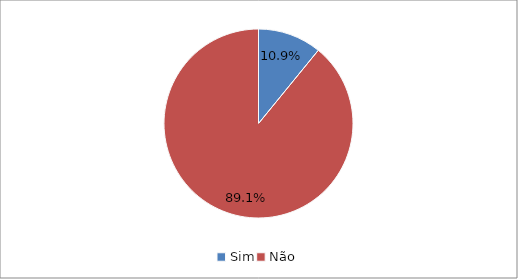
| Category | Series 0 |
|---|---|
| Sim | 0.109 |
| Não | 0.891 |